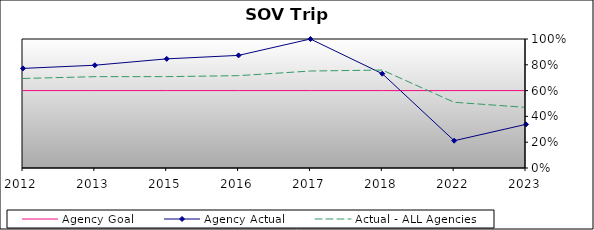
| Category | Agency Goal | Agency Actual | Actual - ALL Agencies |
|---|---|---|---|
| 2012.0 | 0.6 | 0.772 | 0.694 |
| 2013.0 | 0.6 | 0.797 | 0.708 |
| 2015.0 | 0.6 | 0.846 | 0.708 |
| 2016.0 | 0.6 | 0.873 | 0.716 |
| 2017.0 | 0.6 | 1 | 0.752 |
| 2018.0 | 0.6 | 0.731 | 0.759 |
| 2022.0 | 0.6 | 0.212 | 0.509 |
| 2023.0 | 0.6 | 0.338 | 0.47 |